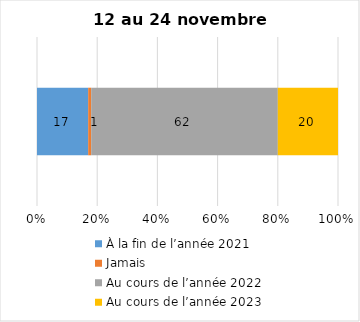
| Category | À la fin de l’année 2021 | Jamais | Au cours de l’année 2022 | Au cours de l’année 2023 |
|---|---|---|---|---|
| 0 | 17 | 1 | 62 | 20 |